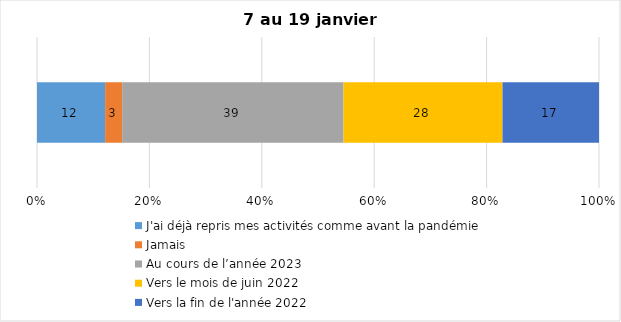
| Category | J'ai déjà repris mes activités comme avant la pandémie | Jamais | Au cours de l’année 2023 | Vers le mois de juin 2022 | Vers la fin de l'année 2022 |
|---|---|---|---|---|---|
| 0 | 12 | 3 | 39 | 28 | 17 |